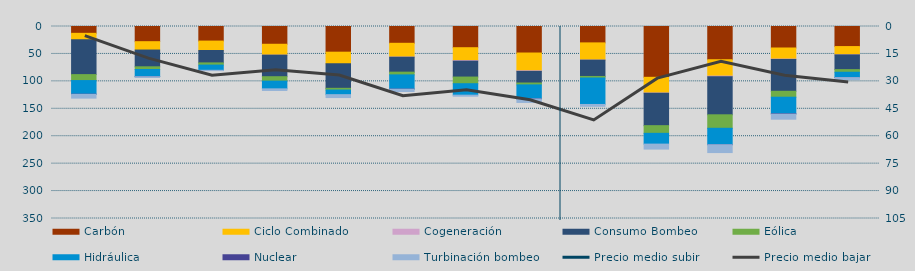
| Category | Carbón | Ciclo Combinado | Cogeneración | Consumo Bombeo | Eólica | Hidráulica | Nuclear | Turbinación bombeo |
|---|---|---|---|---|---|---|---|---|
| M | 12444.9 | 11889.1 | 0 | 63369.7 | 10841.6 | 24843.5 | 260 | 6935.7 |
| J | 27670.2 | 15256.9 | 0 | 30546.6 | 4860.6 | 13133.6 | 35 | 583.9 |
| J | 26575.7 | 17125.2 | 0 | 22647.3 | 4001.3 | 9478.8 | 0 | 608.4 |
| A | 32372.1 | 19882 | 0.8 | 39268.2 | 8039.4 | 14094.1 | 0 | 2953 |
| S | 46810.1 | 21088.9 | 0 | 44806.4 | 3126.2 | 8427.2 | 0 | 5288 |
| O | 30606.2 | 25077.2 | 351.5 | 27192.1 | 4972 | 25903.4 | 171.9 | 4234.4 |
| N | 38654 | 23471.9 | 1088.5 | 28952.2 | 12138.1 | 20858.9 | 0 | 1910.4 |
| D | 48332.5 | 32343 | 1137.1 | 21197.2 | 3426.7 | 25403.7 | 222 | 6361.9 |
| E | 29873.4 | 31257.5 | 232.7 | 29718.6 | 2813.5 | 48230.3 | 0 | 3337.1 |
| F | 92635.5 | 28594.2 | 463.1 | 59071.9 | 13978.3 | 19654.8 | 0 | 9063.5 |
| M | 60556.8 | 29853.7 | 1006.6 | 69541.7 | 24572.7 | 29936.2 | 30 | 14315.8 |
| A | 39185.7 | 20218.6 | 667 | 58045.1 | 10784.5 | 30176.3 | 635.3 | 9263.7 |
| M | 36573.1 | 14965.8 | 259.5 | 26811.1 | 4780.9 | 9611.3 | 138 | 3683.8 |